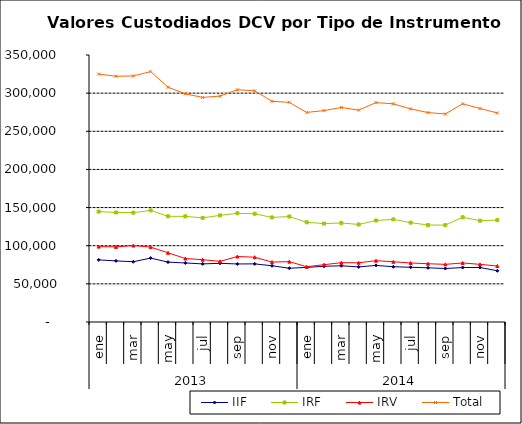
| Category | IIF | IRF | IRV | Total |
|---|---|---|---|---|
| 0 | 81416.888 | 144757.513 | 98829.931 | 325004.333 |
| 1900-01-01 | 80087.618 | 143577.961 | 98462.561 | 322128.139 |
| 1900-01-02 | 78993.419 | 143324.923 | 100231.491 | 322549.833 |
| 1900-01-03 | 83785.228 | 146310.217 | 98211.779 | 328307.224 |
| 1900-01-04 | 78478.232 | 138557.629 | 90743.924 | 307779.784 |
| 1900-01-05 | 77408.288 | 138495.69 | 83206.996 | 299110.974 |
| 1900-01-06 | 76164.567 | 136530.894 | 81675.524 | 294370.984 |
| 1900-01-07 | 76924.923 | 139757.019 | 79486.55 | 296168.491 |
| 1900-01-08 | 76084.621 | 142512.819 | 85843.524 | 304440.963 |
| 1900-01-09 | 76192.422 | 141910.138 | 84955.045 | 303057.604 |
| 1900-01-10 | 73716.671 | 137078.942 | 78541.4 | 289337.013 |
| 1900-01-11 | 70472.419 | 138267.954 | 79143.198 | 287883.571 |
| 1900-01-12 | 71567.13 | 130707.048 | 72428.139 | 274702.317 |
| 1900-01-13 | 73037.524 | 128978.184 | 75132.114 | 277147.821 |
| 1900-01-14 | 73693.631 | 129795.063 | 77731.156 | 281219.85 |
| 1900-01-15 | 72217.535 | 127881.895 | 77628.794 | 277728.225 |
| 1900-01-16 | 74183.619 | 133039.706 | 80406.314 | 287629.639 |
| 1900-01-17 | 72454.93 | 134529.16 | 78989.531 | 285973.621 |
| 1900-01-18 | 71730.17 | 130252.528 | 77341.332 | 279324.03 |
| 1900-01-19 | 71033.229 | 127074.825 | 76395.904 | 274503.958 |
| 1900-01-20 | 70097.317 | 127041.722 | 75568.341 | 272707.38 |
| 1900-01-21 | 71382.521 | 137254.939 | 77399.09 | 286036.549 |
| 1900-01-22 | 71478.14 | 132842.886 | 75561.326 | 279882.352 |
| 1900-01-23 | 67109.708 | 133510.51 | 73395.251 | 274015.469 |